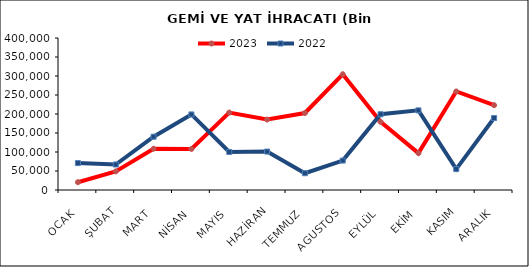
| Category | 2023 | 2022 |
|---|---|---|
| OCAK | 20511.081 | 70779.796 |
| ŞUBAT | 48988.009 | 67064.579 |
| MART | 108585.767 | 140227.688 |
| NİSAN | 107987.693 | 198881.657 |
| MAYIS | 203809.471 | 100124.426 |
| HAZİRAN | 185363.212 | 101131.224 |
| TEMMUZ | 202576.087 | 44142.998 |
| AGUSTOS | 304348.464 | 77395.489 |
| EYLÜL | 179322.189 | 199348.733 |
| EKİM | 96963.819 | 209571.999 |
| KASIM | 259258.754 | 55079.847 |
| ARALIK | 223264.799 | 189314.943 |